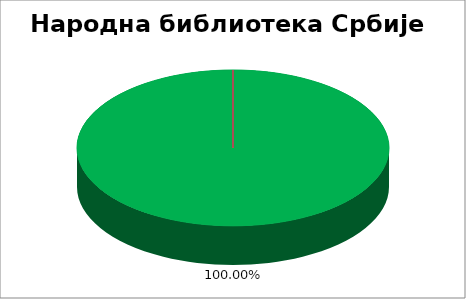
| Category | Народна библиотека Србије |
|---|---|
| 0 | 1 |
| 1 | 0 |
| 2 | 0 |
| 3 | 0 |
| 4 | 0 |